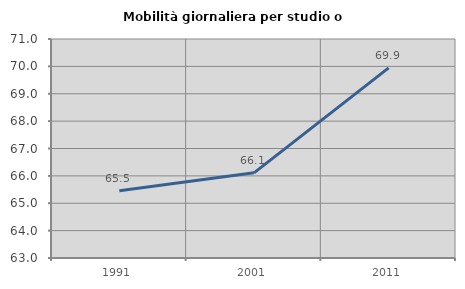
| Category | Mobilità giornaliera per studio o lavoro |
|---|---|
| 1991.0 | 65.458 |
| 2001.0 | 66.111 |
| 2011.0 | 69.946 |